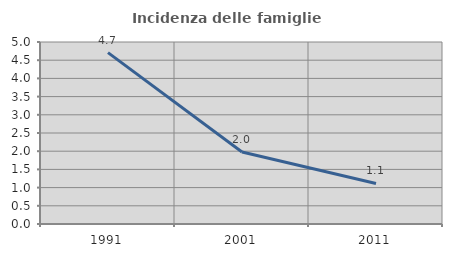
| Category | Incidenza delle famiglie numerose |
|---|---|
| 1991.0 | 4.708 |
| 2001.0 | 1.977 |
| 2011.0 | 1.115 |